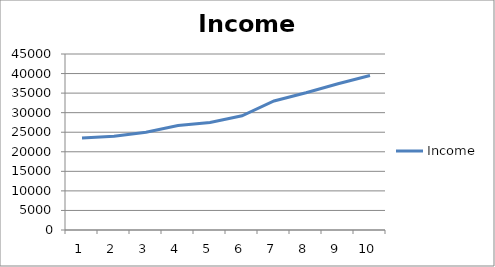
| Category | Income |
|---|---|
| 0 | 23500 |
| 1 | 24000 |
| 2 | 25000 |
| 3 | 26700 |
| 4 | 27500 |
| 5 | 29200 |
| 6 | 33000 |
| 7 | 35100 |
| 8 | 37400 |
| 9 | 39500 |